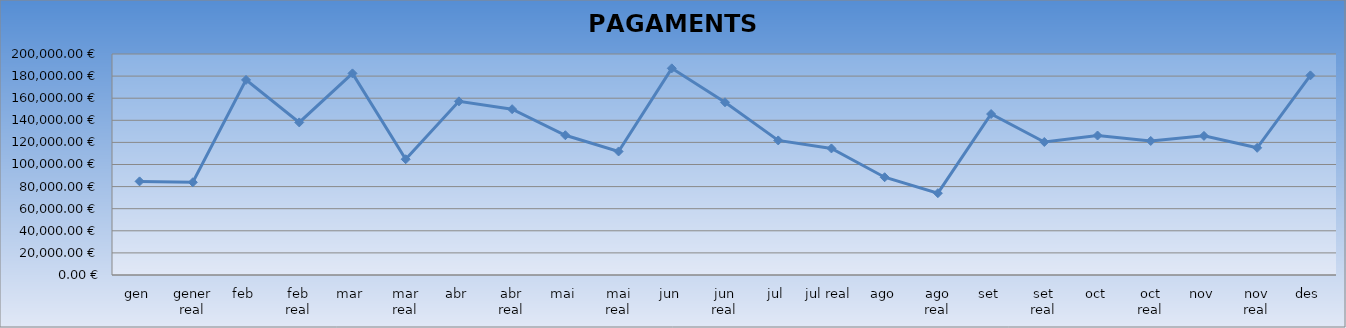
| Category | Series 0 |
|---|---|
| gen | 84715.31 |
| gener real | 83919.83 |
| feb | 176555.06 |
| feb real | 138087.27 |
| mar | 182461.4 |
| mar real | 104757.03 |
| abr | 157146.48 |
| abr real | 150068.88 |
| mai | 126481.32 |
| mai real | 111797.34 |
| jun | 187029.64 |
| jun real | 156328.29 |
| jul | 121776.96 |
| jul real | 114537.11 |
| ago | 88478 |
| ago real | 74065.89 |
| set | 145679.6 |
| set real | 120373.47 |
| oct | 126239.85 |
| oct real | 121284.05 |
| nov | 125899.23 |
| nov real | 115097.49 |
| des | 180643.79 |